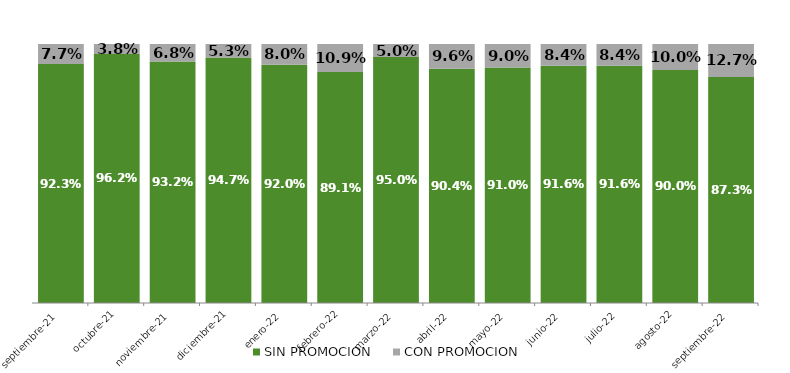
| Category | SIN PROMOCION   | CON PROMOCION   |
|---|---|---|
| 2021-09-01 | 0.923 | 0.077 |
| 2021-10-01 | 0.962 | 0.038 |
| 2021-11-01 | 0.932 | 0.068 |
| 2021-12-01 | 0.947 | 0.053 |
| 2022-01-01 | 0.92 | 0.08 |
| 2022-02-01 | 0.891 | 0.109 |
| 2022-03-01 | 0.95 | 0.05 |
| 2022-04-01 | 0.904 | 0.096 |
| 2022-05-01 | 0.91 | 0.09 |
| 2022-06-01 | 0.916 | 0.084 |
| 2022-07-01 | 0.916 | 0.084 |
| 2022-08-01 | 0.9 | 0.1 |
| 2022-09-01 | 0.873 | 0.127 |